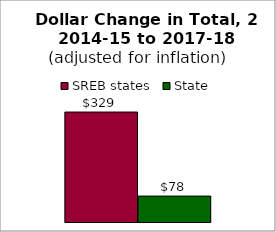
| Category | SREB states | State |
|---|---|---|
| 0 | 328.888 | 77.534 |